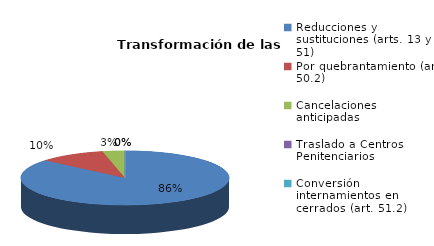
| Category | Series 0 |
|---|---|
| Reducciones y sustituciones (arts. 13 y 51) | 25 |
| Por quebrantamiento (art. 50.2) | 3 |
| Cancelaciones anticipadas | 1 |
| Traslado a Centros Penitenciarios | 0 |
| Conversión internamientos en cerrados (art. 51.2) | 0 |